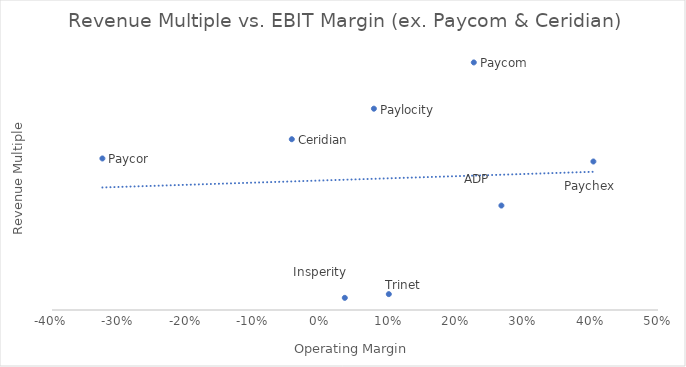
| Category | EV / Revenue |
|---|---|
| 0.2674252519529848 | 6.19 |
| 0.03485401166298009 | 0.72 |
| 0.40404040404040403 | 8.8 |
| 0.10022026431718062 | 0.94 |
| 0.22642619642690062 | 14.67 |
| -0.04384881422924901 | 10.12 |
| 0.07806000750270736 | 11.93 |
| -0.3251612182017621 | 8.98 |